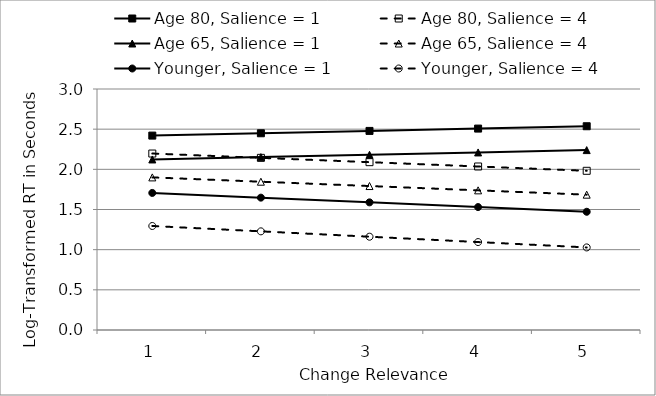
| Category | Age 80, Salience = 1 | Age 80, Salience = 4 | Age 65, Salience = 1 | Age 65, Salience = 4 | Younger, Salience = 1 | Younger, Salience = 4 |
|---|---|---|---|---|---|---|
| 0 | 2.42 | 2.197 | 2.123 | 1.9 | 1.706 | 1.295 |
| 1 | 2.449 | 2.143 | 2.152 | 1.846 | 1.648 | 1.228 |
| 2 | 2.478 | 2.089 | 2.181 | 1.792 | 1.589 | 1.161 |
| 3 | 2.507 | 2.035 | 2.21 | 1.738 | 1.53 | 1.095 |
| 4 | 2.536 | 1.982 | 2.239 | 1.685 | 1.472 | 1.028 |